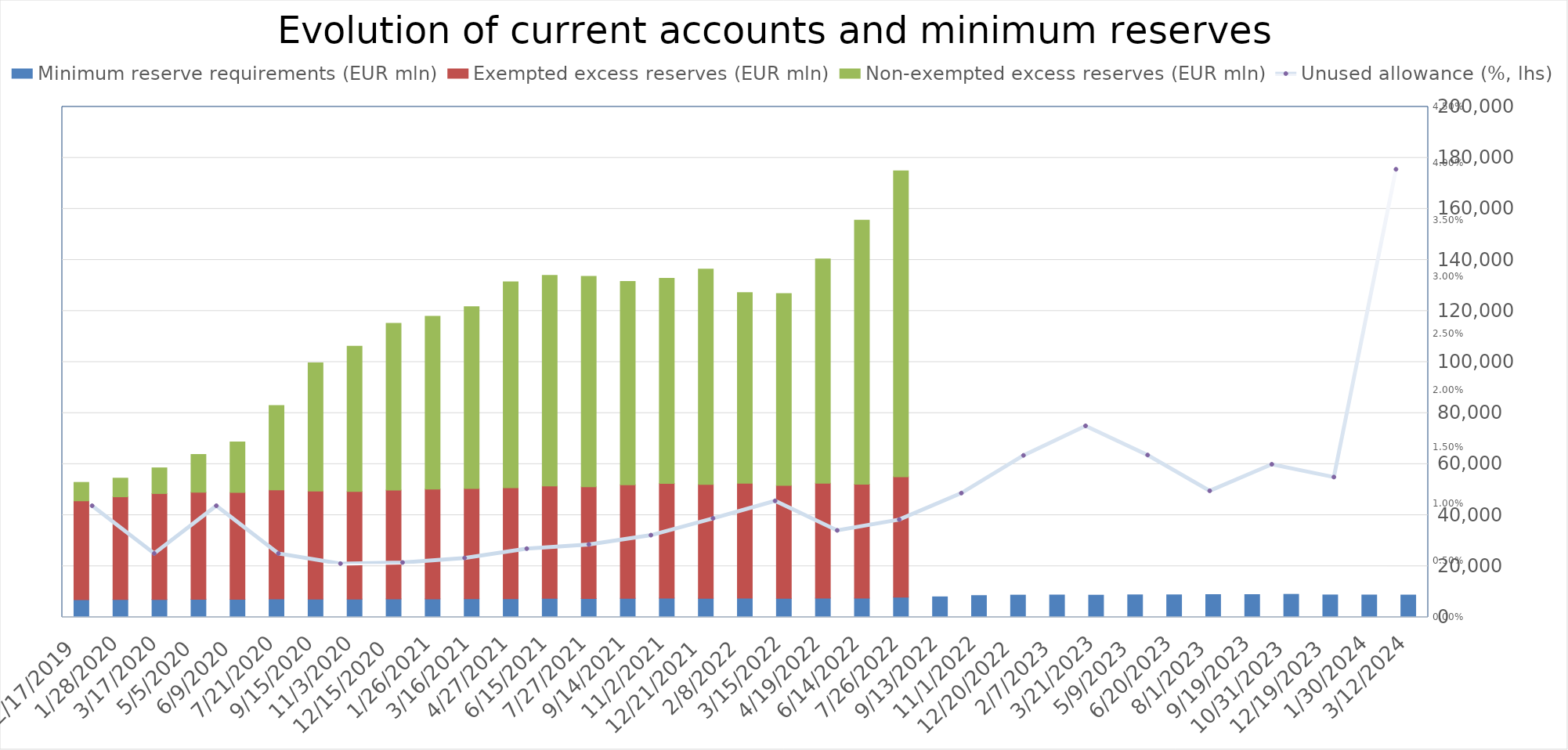
| Category | Minimum reserve requirements (EUR mln) | Exempted excess reserves (EUR mln) | Non-exempted excess reserves (EUR mln) |
|---|---|---|---|
| 3/12/24 | 8722 | 0 | 0 |
| 1/30/24 | 8741.019 | 0 | 0 |
| 12/19/23 | 8762 | 0 | 0 |
| 10/31/23 | 9001 | 0 | 0 |
| 9/19/23 | 8896 | 0 | 0 |
| 8/1/23 | 8904 | 0 | 0 |
| 6/20/23 | 8799 | 0 | 0 |
| 5/9/23 | 8796 | 0 | 0 |
| 3/21/23 | 8668 | 0 | 0 |
| 2/7/23 | 8736 | 0 | 0 |
| 12/20/22 | 8689 | 0 | 0 |
| 11/1/22 | 8517 | 0 | 0 |
| 9/13/22 | 8018 | 0 | 0 |
| 7/26/22 | 7929 | 47109 | 119909 |
| 6/14/22 | 7495 | 44621 | 103454 |
| 4/19/22 | 7536 | 44962 | 87885 |
| 3/15/22 | 7409 | 44244 | 75192 |
| 2/8/22 | 7536 | 44997 | 74696 |
| 12/21/21 | 7472 | 44599 | 84381 |
| 11/2/21 | 7531 | 44914 | 80355 |
| 9/14/21 | 7460 | 44471 | 79647 |
| 7/27/21 | 7352 | 43793 | 82435 |
| 6/15/21 | 7404 | 44036 | 82520 |
| 4/27/21 | 7313 | 43430 | 80697 |
| 3/16/21 | 7254 | 43192 | 71224 |
| 1/26/21 | 7225 | 42978 | 67723 |
| 12/15/20 | 7190 | 42671 | 65344 |
| 11/3/20 | 7128 | 42161 | 56951 |
| 9/15/20 | 7165 | 42265 | 50289 |
| 7/21/20 | 7217 | 42685 | 33099 |
| 6/9/20 | 7060 | 41891 | 19741 |
| 5/5/20 | 7085 | 41937 | 14783 |
| 3/17/20 | 7002 | 41491 | 10061 |
| 1/28/20 | 6981 | 40234 | 7303 |
| 12/17/19 | 6887 | 38752 | 7220 |